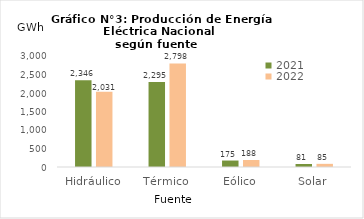
| Category | 2021 | 2022 |
|---|---|---|
| Hidráulico | 2346.115 | 2030.573 |
| Térmico | 2294.764 | 2797.514 |
| Eólico | 174.61 | 188.456 |
| Solar | 80.871 | 85.328 |